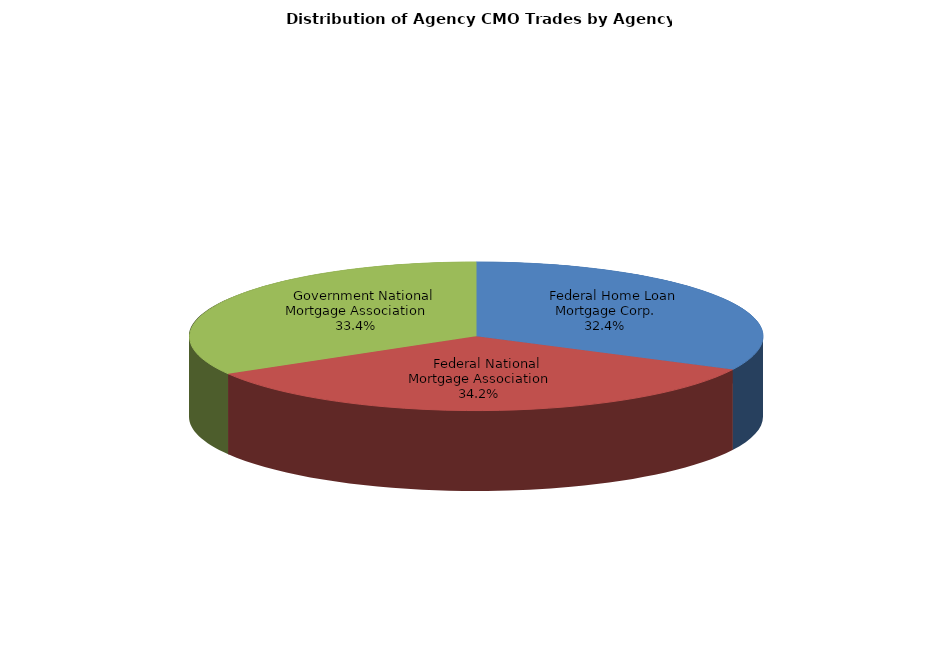
| Category | Series 0 |
|---|---|
|     Federal Home Loan Mortgage Corp. | 383.718 |
|     Federal National Mortgage Association | 404.706 |
|     Government National Mortgage Association | 395.841 |